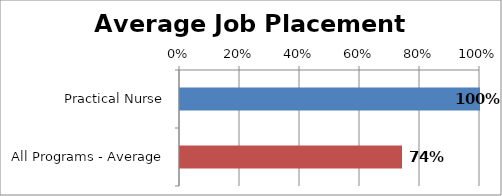
| Category | Series 0 |
|---|---|
| Practical Nurse | 1 |
| All Programs - Average | 0.74 |